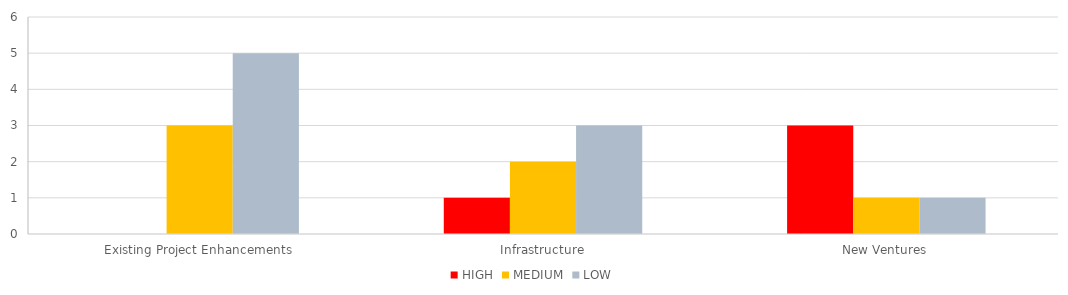
| Category | HIGH | MEDIUM | LOW |
|---|---|---|---|
| Existing Project Enhancements | 0 | 3 | 5 |
| Infrastructure | 1 | 2 | 3 |
| New Ventures | 3 | 1 | 1 |